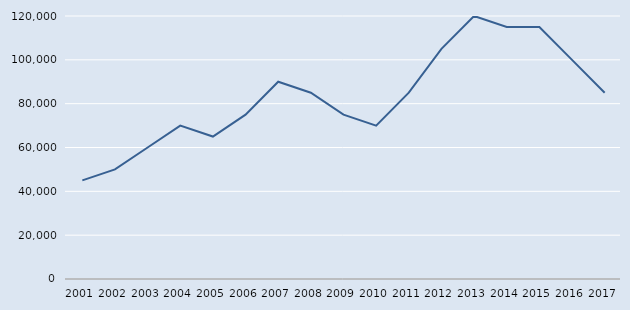
| Category | Series 1 |
|---|---|
| 2001.0 | 45000 |
| 2002.0 | 50000 |
| 2003.0 | 60000 |
| 2004.0 | 70000 |
| 2005.0 | 65000 |
| 2006.0 | 75000 |
| 2007.0 | 90000 |
| 2008.0 | 85000 |
| 2009.0 | 75000 |
| 2010.0 | 70000 |
| 2011.0 | 85000 |
| 2012.0 | 105000 |
| 2013.0 | 120000 |
| 2014.0 | 115000 |
| 2015.0 | 115000 |
| 2016.0 | 100000 |
| 2017.0 | 85000 |